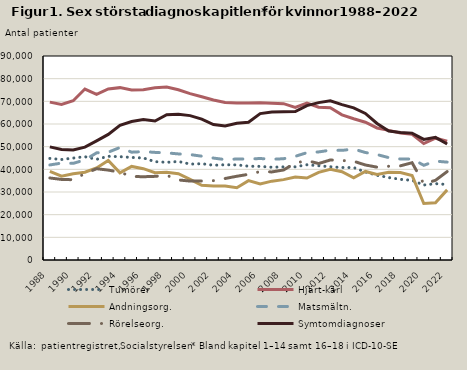
| Category | Tumörer | Hjärt-kärl | Andningsorg.  | Matsmältn. | Rörelseorg.  | Symtomdiagnoser |
|---|---|---|---|---|---|---|
| 1988.0 | 44809 | 69664 | 39076 | 41938 | 36184 | 49911 |
| 1989.0 | 44341 | 68597 | 36987 | 42750 | 35545 | 48765 |
| 1990.0 | 44972 | 70267 | 38016 | 42633 | 35418 | 48544 |
| 1991.0 | 45579 | 75432 | 38719 | 44173 | 38123 | 49811 |
| 1992.0 | 44402 | 73045 | 40587 | 47266 | 40267 | 52544 |
| 1993.0 | 45754 | 75491 | 43939 | 47562 | 39668 | 55414 |
| 1994.0 | 45583 | 76043 | 38474 | 49639 | 38708 | 59460 |
| 1995.0 | 45238 | 75000 | 41290 | 47570 | 36880 | 61108 |
| 1996.0 | 45013 | 75079 | 40287 | 47823 | 36735 | 61932 |
| 1997.0 | 43388 | 75985 | 38530 | 47478 | 36906 | 61293 |
| 1998.0 | 43084 | 76307 | 38697 | 47258 | 37352 | 64067 |
| 1999.0 | 43477 | 75106 | 38053 | 46805 | 35324 | 64278 |
| 2000.0 | 42308 | 73423 | 35601 | 46523 | 34817 | 63700 |
| 2001.0 | 42478 | 72032 | 32980 | 45798 | 34852 | 62159 |
| 2002.0 | 41807 | 70563 | 32647 | 44967 | 35016 | 59749 |
| 2003.0 | 42019 | 69456 | 32652 | 44301 | 35959 | 59113 |
| 2004.0 | 41955 | 69268 | 31877 | 44556 | 36951 | 60322 |
| 2005.0 | 41377 | 69289 | 35020 | 44560 | 37789 | 60782 |
| 2006.0 | 41298 | 69405 | 33516 | 44775 | 39009 | 64592 |
| 2007.0 | 40928 | 69202 | 34785 | 44440 | 38860 | 65267 |
| 2008.0 | 41094 | 68960 | 35458 | 44682 | 39717 | 65387 |
| 2009.0 | 41101 | 67331 | 36633 | 45748 | 42770 | 65492 |
| 2010.0 | 42011 | 69235 | 36166 | 47343 | 43862 | 68133 |
| 2011.0 | 41574 | 67403 | 38668 | 47686 | 42552 | 69431 |
| 2012.0 | 41129 | 67160 | 40029 | 48436 | 44127 | 70222 |
| 2013.0 | 40811 | 64056 | 38961 | 48363 | 43905 | 68540 |
| 2014.0 | 40789 | 62314 | 36269 | 48941 | 43556 | 67090 |
| 2015.0 | 38820 | 60780 | 39070 | 47423 | 41920 | 64668 |
| 2016.0 | 37380 | 58253 | 37721 | 46504 | 40957 | 60233 |
| 2017.0 | 36369 | 57199 | 38715 | 45166 | 41353 | 56925 |
| 2018.0 | 35583 | 56002 | 38592 | 44544 | 41551 | 56236 |
| 2019.0 | 35149 | 55496 | 37311 | 44572 | 42915 | 55979 |
| 2020.0 | 33087 | 51350 | 24919 | 41789 | 33594 | 53207 |
| 2021.0 | 33668 | 53736 | 25222 | 43610 | 35150 | 54118 |
| 2022.0 | 33320 | 52367 | 30938 | 43182 | 39001 | 51166 |